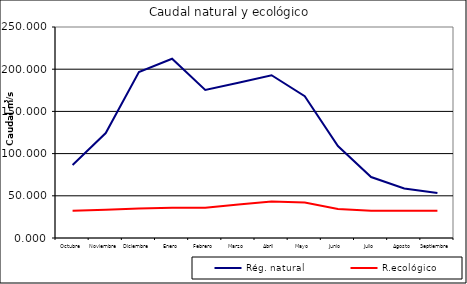
| Category | Rég. natural | R.ecológico |
|---|---|---|
| Octubre | 86.568 | 32.396 |
| Noviembre | 124.306 | 33.555 |
| Diciembre | 196.554 | 34.921 |
| Enero | 212.432 | 35.791 |
| Febrero | 175.35 | 35.831 |
| Marzo | 183.86 | 39.608 |
| Abril | 192.882 | 43.278 |
| Mayo | 168.014 | 42.138 |
| Junio | 108.88 | 34.357 |
| Julio | 72.26 | 32.396 |
| Agosto | 58.598 | 32.396 |
| Septiembre | 53.315 | 32.396 |